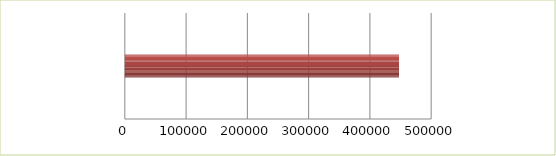
| Category | Series 0 | Series 1 |
|---|---|---|
| 0 | 2.5 | 0 |
| 1 | 2.6 | 447500 |
| 2 | 2.7 | 0 |